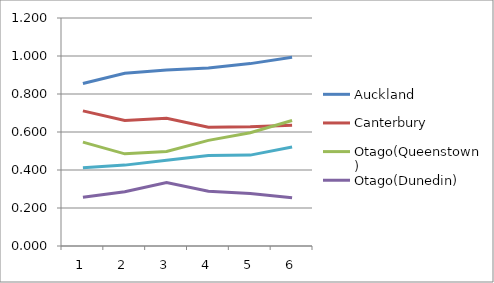
| Category | Auckland | Canterbury | Otago(Queenstown) | Otago(Dunedin) | Wellington |
|---|---|---|---|---|---|
| 0 | 0.855 | 0.711 | 0.547 | 0.256 | 0.412 |
| 1 | 0.909 | 0.66 | 0.485 | 0.285 | 0.426 |
| 2 | 0.926 | 0.672 | 0.498 | 0.334 | 0.452 |
| 3 | 0.937 | 0.626 | 0.556 | 0.288 | 0.476 |
| 4 | 0.96 | 0.627 | 0.596 | 0.276 | 0.478 |
| 5 | 0.993 | 0.636 | 0.66 | 0.253 | 0.522 |